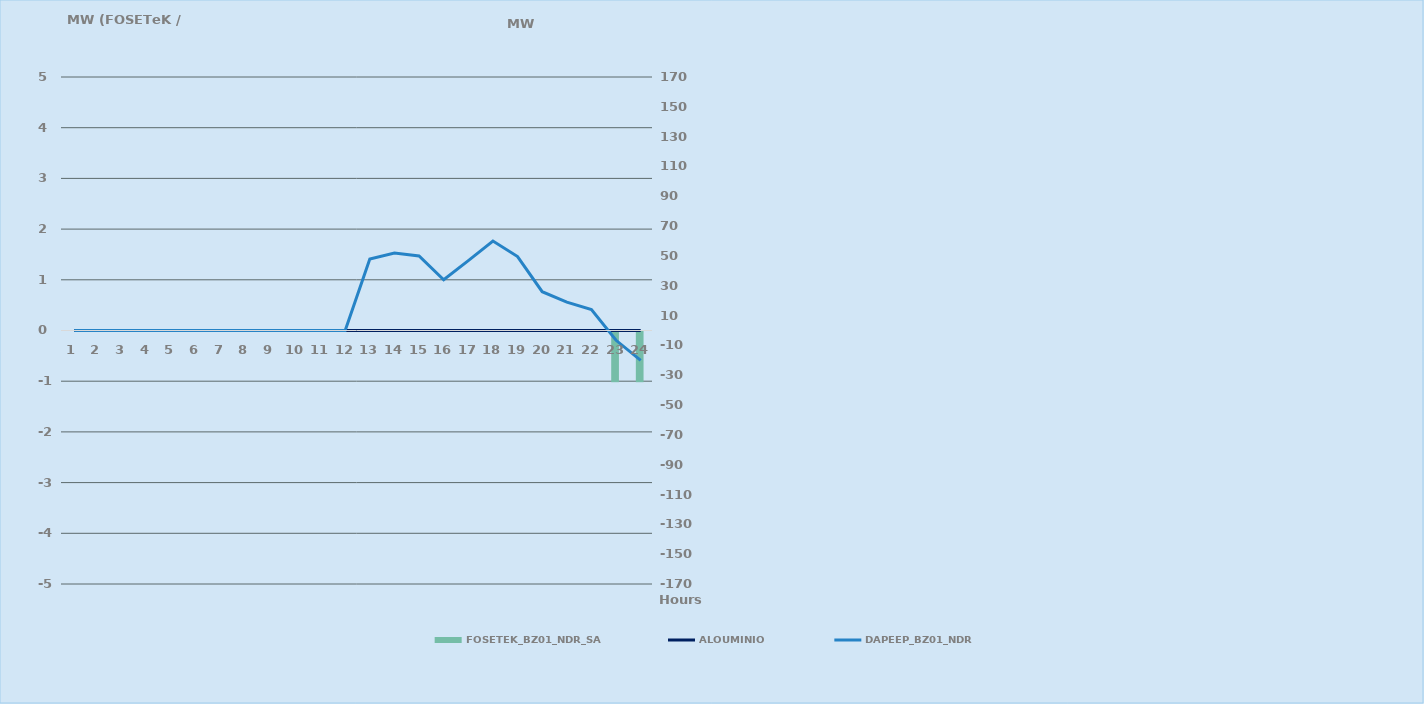
| Category | FOSETEK_BZ01_NDR_SA |
|---|---|
| 0 | 0 |
| 1 | 0 |
| 2 | 0 |
| 3 | 0 |
| 4 | 0 |
| 5 | 0 |
| 6 | 0 |
| 7 | 0 |
| 8 | 0 |
| 9 | 0 |
| 10 | 0 |
| 11 | 0 |
| 12 | 0 |
| 13 | 0 |
| 14 | 0 |
| 15 | 0 |
| 16 | 0 |
| 17 | 0 |
| 18 | 0 |
| 19 | 0 |
| 20 | 0 |
| 21 | 0 |
| 22 | -1 |
| 23 | -1 |